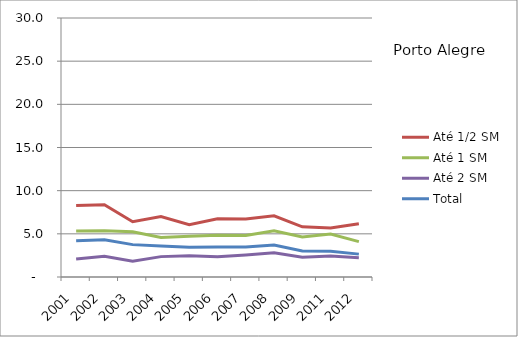
| Category | Até 1/2 SM | Até 1 SM | Até 2 SM | Total |
|---|---|---|---|---|
| 2001.0 | 8.28 | 5.33 | 2.08 | 4.19 |
| 2002.0 | 8.38 | 5.37 | 2.4 | 4.31 |
| 2003.0 | 6.4 | 5.24 | 1.84 | 3.75 |
| 2004.0 | 7 | 4.57 | 2.36 | 3.6 |
| 2005.0 | 6.06 | 4.71 | 2.45 | 3.46 |
| 2006.0 | 6.75 | 4.84 | 2.35 | 3.48 |
| 2007.0 | 6.73 | 4.8 | 2.56 | 3.48 |
| 2008.0 | 7.09 | 5.35 | 2.8 | 3.7 |
| 2009.0 | 5.81 | 4.64 | 2.28 | 3.02 |
| 2011.0 | 5.67 | 4.98 | 2.43 | 2.97 |
| 2012.0 | 6.18 | 4.1 | 2.22 | 2.65 |